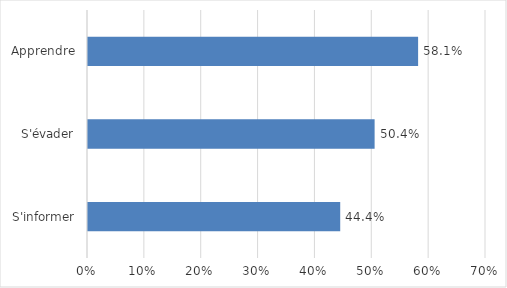
| Category | Series 0 |
|---|---|
| S'informer | 0.444 |
| S'évader | 0.504 |
| Apprendre | 0.581 |